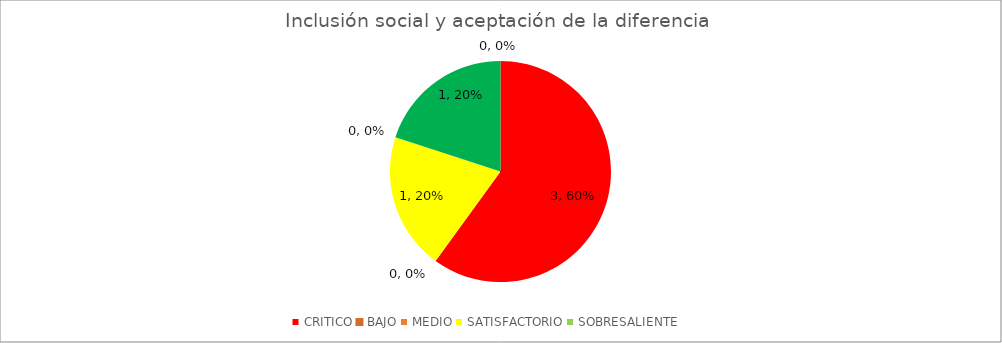
| Category | Inclusión social y aceptación de la diferencia  |
|---|---|
| CRITICO | 3 |
| BAJO | 0 |
| MEDIO | 1 |
| SATISFACTORIO | 0 |
| SOBRESALIENTE | 1 |